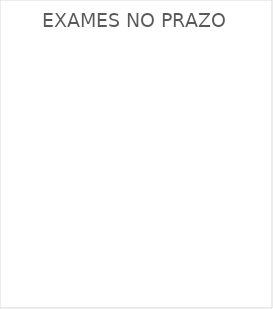
| Category | EXAMES NO PRAZO |
|---|---|
| 0 | 0 |
| 1 | 6 |